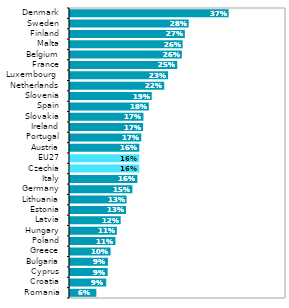
| Category | Series 0 |
|---|---|
| Romania | 0.063 |
| Croatia | 0.086 |
| Cyprus | 0.09 |
| Bulgaria | 0.09 |
| Greece | 0.096 |
| Poland | 0.108 |
| Hungary | 0.111 |
| Latvia | 0.12 |
| Estonia | 0.132 |
| Lithuania | 0.133 |
| Germany | 0.147 |
| Italy | 0.158 |
| Czechia | 0.163 |
| EU27 | 0.163 |
| Austria | 0.163 |
| Portugal | 0.167 |
| Ireland | 0.172 |
| Slovakia | 0.172 |
| Spain | 0.185 |
| Slovenia | 0.192 |
| Netherlands | 0.22 |
| Luxembourg  | 0.229 |
| France | 0.251 |
| Belgium | 0.261 |
| Malta | 0.263 |
| Finland | 0.268 |
| Sweden | 0.277 |
| Denmark | 0.369 |